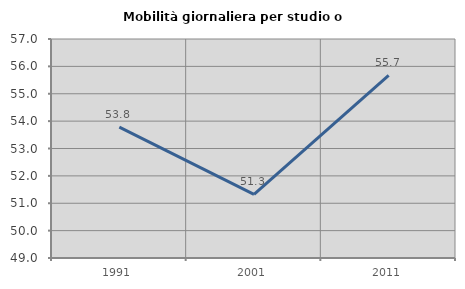
| Category | Mobilità giornaliera per studio o lavoro |
|---|---|
| 1991.0 | 53.78 |
| 2001.0 | 51.326 |
| 2011.0 | 55.668 |